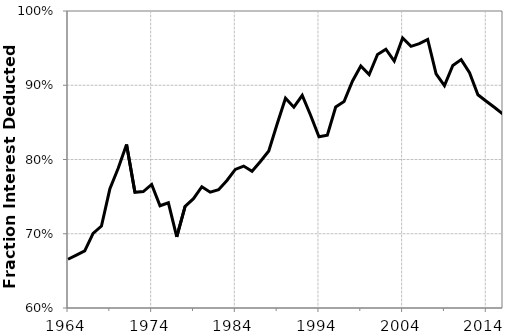
| Category | %deducted |
|---|---|
| 1964.0 | 0.666 |
| 1965.0 | 0.671 |
| 1966.0 | 0.677 |
| 1967.0 | 0.701 |
| 1968.0 | 0.71 |
| 1969.0 | 0.76 |
| 1970.0 | 0.788 |
| 1971.0 | 0.82 |
| 1972.0 | 0.756 |
| 1973.0 | 0.757 |
| 1974.0 | 0.766 |
| 1975.0 | 0.738 |
| 1976.0 | 0.742 |
| 1977.0 | 0.696 |
| 1978.0 | 0.737 |
| 1979.0 | 0.747 |
| 1980.0 | 0.763 |
| 1981.0 | 0.756 |
| 1982.0 | 0.759 |
| 1983.0 | 0.772 |
| 1984.0 | 0.787 |
| 1985.0 | 0.791 |
| 1986.0 | 0.784 |
| 1987.0 | 0.797 |
| 1988.0 | 0.812 |
| 1989.0 | 0.848 |
| 1990.0 | 0.882 |
| 1991.0 | 0.87 |
| 1992.0 | 0.886 |
| 1993.0 | 0.86 |
| 1994.0 | 0.831 |
| 1995.0 | 0.833 |
| 1996.0 | 0.871 |
| 1997.0 | 0.878 |
| 1998.0 | 0.905 |
| 1999.0 | 0.926 |
| 2000.0 | 0.914 |
| 2001.0 | 0.941 |
| 2002.0 | 0.949 |
| 2003.0 | 0.933 |
| 2004.0 | 0.964 |
| 2005.0 | 0.952 |
| 2006.0 | 0.956 |
| 2007.0 | 0.962 |
| 2008.0 | 0.915 |
| 2009.0 | 0.899 |
| 2010.0 | 0.927 |
| 2011.0 | 0.935 |
| 2012.0 | 0.917 |
| 2013.0 | 0.887 |
| 2014.0 | 0.878 |
| 2015.0 | 0.87 |
| 2016.0 | 0.861 |